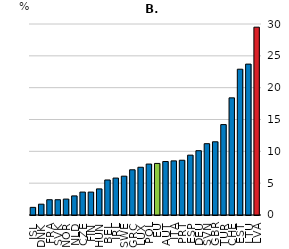
| Category | Females |
|---|---|
| ISL | 1.2 |
| DNK | 1.7 |
| FRA | 2.4 |
| SVK | 2.4 |
| NOR | 2.5 |
| NLD | 3 |
| CZE | 3.6 |
| FIN | 3.6 |
| HUN | 4.1 |
| BEL | 5.5 |
| IRL | 5.8 |
| SWE | 6.1 |
| GRC | 7.1 |
| LUX | 7.5 |
| POL | 8 |
| EU | 8.1 |
| AUT | 8.4 |
| ITA | 8.5 |
| PRT | 8.6 |
| ESP | 9.4 |
| DEU | 10.1 |
| SVN | 11.2 |
| GBR | 11.5 |
| TUR | 14.2 |
| CHE | 18.4 |
| EST | 22.9 |
| LTU | 23.7 |
| LVA | 29.5 |